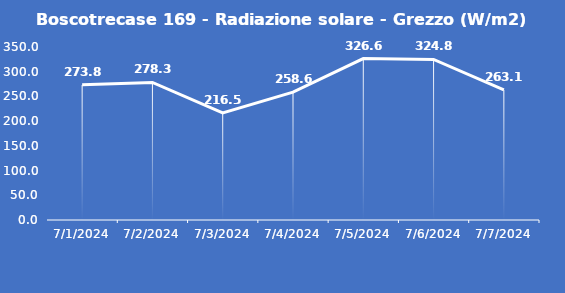
| Category | Boscotrecase 169 - Radiazione solare - Grezzo (W/m2) |
|---|---|
| 7/1/24 | 273.8 |
| 7/2/24 | 278.3 |
| 7/3/24 | 216.5 |
| 7/4/24 | 258.6 |
| 7/5/24 | 326.6 |
| 7/6/24 | 324.8 |
| 7/7/24 | 263.1 |